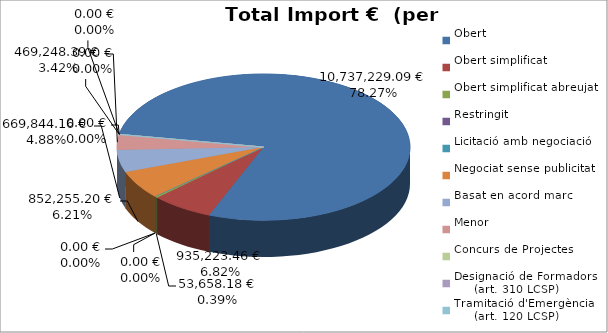
| Category | Total preu
(amb IVA) |
|---|---|
| Obert | 10737229.085 |
| Obert simplificat | 935223.459 |
| Obert simplificat abreujat | 53658.176 |
| Restringit | 0 |
| Licitació amb negociació | 0 |
| Negociat sense publicitat | 852255.199 |
| Basat en acord marc | 669844.162 |
| Menor | 469248.394 |
| Concurs de Projectes | 0 |
| Designació de Formadors
     (art. 310 LCSP) | 0 |
| Tramitació d'Emergència
     (art. 120 LCSP) | 0 |